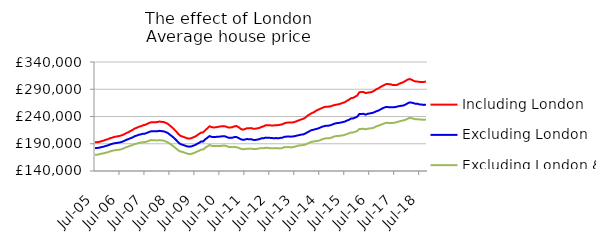
| Category | Including London | Excluding London | Excluding London & SE |
|---|---|---|---|
| 2005-07-01 | 192637.159 | 181907.72 | 169795.831 |
| 2005-08-01 | 192884.354 | 182204.23 | 169987.184 |
| 2005-09-01 | 193456.443 | 182742.056 | 170702.858 |
| 2005-10-01 | 194586.143 | 183737.129 | 171701.029 |
| 2005-11-01 | 195531.81 | 184532.419 | 172389.265 |
| 2005-12-01 | 197150.584 | 185848.339 | 173484.345 |
| 2006-01-01 | 198153.754 | 186784.385 | 174234.386 |
| 2006-02-01 | 199813.466 | 188293.933 | 175667.543 |
| 2006-03-01 | 200983.99 | 189563.153 | 176864.263 |
| 2006-04-01 | 202245.961 | 190631.185 | 177763.943 |
| 2006-05-01 | 203065.042 | 191320.143 | 178237.47 |
| 2006-06-01 | 203685.673 | 191766.348 | 178667.182 |
| 2006-07-01 | 204559.278 | 192518.713 | 179240.302 |
| 2006-08-01 | 205714.078 | 193584.707 | 180374.517 |
| 2006-09-01 | 207431.746 | 195106.329 | 181749.008 |
| 2006-10-01 | 209492.23 | 197111.646 | 183707.283 |
| 2006-11-01 | 211163.513 | 198406.834 | 184803.513 |
| 2006-12-01 | 213373.811 | 200184.26 | 186416.618 |
| 2007-01-01 | 215210.655 | 201535.877 | 187495.779 |
| 2007-02-01 | 217819.553 | 203758.447 | 189382.285 |
| 2007-03-01 | 219232.983 | 204906.873 | 190190.222 |
| 2007-04-01 | 221043.784 | 206461.247 | 191479.848 |
| 2007-05-01 | 222128.218 | 207210.749 | 192197.244 |
| 2007-06-01 | 223865.002 | 208372.622 | 192900.311 |
| 2007-07-01 | 224582.145 | 208580.061 | 193035.973 |
| 2007-08-01 | 226402.251 | 210003.659 | 194051.294 |
| 2007-09-01 | 228182.408 | 211660.89 | 195600.841 |
| 2007-10-01 | 229491.543 | 212979.597 | 196744.628 |
| 2007-11-01 | 229231.088 | 212815.295 | 196339.408 |
| 2007-12-01 | 229404.46 | 212905.332 | 196268.186 |
| 2008-01-01 | 229854.007 | 213027.6 | 195912.124 |
| 2008-02-01 | 230778.597 | 213705.985 | 196694.794 |
| 2008-03-01 | 230153.08 | 213164.837 | 196101.029 |
| 2008-04-01 | 229721.005 | 212737.65 | 195822.963 |
| 2008-05-01 | 228299.829 | 211346.238 | 194168.374 |
| 2008-06-01 | 226513.482 | 209628.718 | 192662.12 |
| 2008-07-01 | 223227.056 | 206570.363 | 189831.839 |
| 2008-08-01 | 220141.088 | 203679.753 | 187225.176 |
| 2008-09-01 | 216463.272 | 200406.398 | 184122.693 |
| 2008-10-01 | 212510.657 | 196770.87 | 181148.64 |
| 2008-11-01 | 207922.628 | 192723.223 | 178029.517 |
| 2008-12-01 | 204675.242 | 189438.674 | 175758.498 |
| 2009-01-01 | 203165.33 | 188120.612 | 174922.017 |
| 2009-02-01 | 201911.844 | 186937.237 | 173762.452 |
| 2009-03-01 | 200225.813 | 185488.87 | 172349.467 |
| 2009-04-01 | 199383.576 | 184697.341 | 171110.985 |
| 2009-05-01 | 199859.253 | 184756.733 | 171205.109 |
| 2009-06-01 | 201412.925 | 186174.835 | 172334.989 |
| 2009-07-01 | 203027.61 | 187480.446 | 173713.12 |
| 2009-08-01 | 205323.71 | 189670.327 | 175544.14 |
| 2009-09-01 | 208069.093 | 191780.428 | 177250.424 |
| 2009-10-01 | 210492.42 | 194114.663 | 179195.013 |
| 2009-11-01 | 210907.6 | 194343.802 | 179474.947 |
| 2009-12-01 | 215086.622 | 198299.021 | 182879.128 |
| 2010-01-01 | 218354.797 | 201001.848 | 185163.534 |
| 2010-02-01 | 222015.55 | 204057.089 | 187708.694 |
| 2010-03-01 | 220623.663 | 202645.504 | 186217.211 |
| 2010-04-01 | 219905.901 | 202176.286 | 185722.593 |
| 2010-05-01 | 220113.626 | 202560.477 | 185660.627 |
| 2010-06-01 | 220921.717 | 202881.827 | 185810.225 |
| 2010-07-01 | 221564.916 | 203122.974 | 185746.775 |
| 2010-08-01 | 222318.029 | 203658.874 | 186337.462 |
| 2010-09-01 | 222269.425 | 203857.033 | 186786.545 |
| 2010-10-01 | 221434.684 | 202970.552 | 186021.486 |
| 2010-11-01 | 219854.924 | 201144.854 | 184354.861 |
| 2010-12-01 | 219866.03 | 200772.354 | 183953.951 |
| 2011-01-01 | 220405.999 | 201085.753 | 183724.506 |
| 2011-02-01 | 222145.885 | 202302.374 | 184279.405 |
| 2011-03-01 | 222431.145 | 202224.902 | 183521.52 |
| 2011-04-01 | 220277.333 | 200405.646 | 182499.86 |
| 2011-05-01 | 217364.071 | 198328.18 | 180845.101 |
| 2011-06-01 | 215781.529 | 197203.528 | 180025.16 |
| 2011-07-01 | 216886.961 | 197679.846 | 180204.195 |
| 2011-08-01 | 218462.386 | 198609.764 | 180911.764 |
| 2011-09-01 | 218447.96 | 198336.118 | 180896.336 |
| 2011-10-01 | 218746.451 | 198390.032 | 181179.074 |
| 2011-11-01 | 217505.539 | 197130.138 | 180183.324 |
| 2011-12-01 | 217590.911 | 196985.648 | 180310.287 |
| 2012-01-01 | 218300.924 | 197626.217 | 180700.792 |
| 2012-02-01 | 219064.04 | 198509.293 | 181516.234 |
| 2012-03-01 | 220982.893 | 200008.532 | 182063.76 |
| 2012-04-01 | 221888.073 | 200155.168 | 181813.842 |
| 2012-05-01 | 224080.255 | 201265.513 | 182442.614 |
| 2012-06-01 | 224094.767 | 201103.147 | 182450.163 |
| 2012-07-01 | 223904.739 | 200785.472 | 181887.565 |
| 2012-08-01 | 223391.425 | 200470.454 | 181782.505 |
| 2012-09-01 | 223676.621 | 200097.203 | 181530.42 |
| 2012-10-01 | 224076.65 | 200441.649 | 182155.422 |
| 2012-11-01 | 224222.02 | 199942.059 | 181394.869 |
| 2012-12-01 | 224932.069 | 200752.198 | 181819.304 |
| 2013-01-01 | 225725.691 | 200982.997 | 181992.077 |
| 2013-02-01 | 227657.684 | 202887.461 | 183982.638 |
| 2013-03-01 | 228536.318 | 203048.201 | 183714.128 |
| 2013-04-01 | 229161.736 | 203446.577 | 184041.738 |
| 2013-05-01 | 228933.746 | 202978.692 | 183179.668 |
| 2013-06-01 | 229215.618 | 203313.988 | 184002.652 |
| 2013-07-01 | 230067.874 | 204001.956 | 184567.567 |
| 2013-08-01 | 231582.352 | 204974.592 | 185829.063 |
| 2013-09-01 | 233071.269 | 205820.443 | 186816.952 |
| 2013-10-01 | 234544.706 | 206712.595 | 187392.956 |
| 2013-11-01 | 235649.654 | 207108.713 | 187518.32 |
| 2013-12-01 | 237829.132 | 208690.471 | 188380.852 |
| 2014-01-01 | 241172.518 | 210845.071 | 190258.481 |
| 2014-02-01 | 243555.901 | 212961.021 | 191924.926 |
| 2014-03-01 | 246091.044 | 214920.699 | 193529.609 |
| 2014-04-01 | 247497.872 | 215742.692 | 194071.52 |
| 2014-05-01 | 250020.497 | 216873.39 | 194767.88 |
| 2014-06-01 | 252131.969 | 217799.223 | 195254.109 |
| 2014-07-01 | 253728.94 | 219290.342 | 196257.739 |
| 2014-08-01 | 255600.623 | 221085.588 | 198018.95 |
| 2014-09-01 | 257111.229 | 222135.43 | 199079.718 |
| 2014-10-01 | 258073.581 | 223029.625 | 200160.045 |
| 2014-11-01 | 258087.083 | 223011.964 | 199843.07 |
| 2014-12-01 | 258355.146 | 223877.078 | 200718.802 |
| 2015-01-01 | 259818.582 | 225210.893 | 201785.11 |
| 2015-02-01 | 261058.597 | 226814.296 | 203490.572 |
| 2015-03-01 | 261701.1 | 227767.121 | 204141.593 |
| 2015-04-01 | 262401.663 | 228109.591 | 204365.531 |
| 2015-05-01 | 263522.572 | 228848.656 | 204714.335 |
| 2015-06-01 | 265038.057 | 229662.855 | 205471.122 |
| 2015-07-01 | 266149.558 | 230709.975 | 206333.662 |
| 2015-08-01 | 268751.273 | 232422.039 | 208026.359 |
| 2015-09-01 | 270772.804 | 233951.289 | 209022.454 |
| 2015-10-01 | 273642.208 | 236127.485 | 210714.392 |
| 2015-11-01 | 274283.861 | 236389.602 | 210643.36 |
| 2015-12-01 | 276419.926 | 238068.942 | 212021.052 |
| 2016-01-01 | 278666.894 | 239684.952 | 213316.584 |
| 2016-02-01 | 284429.326 | 244573.995 | 217105.031 |
| 2016-03-01 | 284960.108 | 244731.444 | 217261.044 |
| 2016-04-01 | 284944.646 | 244897.165 | 217499.971 |
| 2016-05-01 | 282948.008 | 243398.657 | 216367.949 |
| 2016-06-01 | 283814.098 | 244972.216 | 217645.462 |
| 2016-07-01 | 284190.963 | 245619.864 | 217954.862 |
| 2016-08-01 | 285049.367 | 246455.532 | 218604.261 |
| 2016-09-01 | 286912.583 | 247394.501 | 219476.719 |
| 2016-10-01 | 289670.712 | 249511.292 | 221752.508 |
| 2016-11-01 | 291498.925 | 250634.807 | 222803.879 |
| 2016-12-01 | 293658.117 | 252653.031 | 224422.401 |
| 2017-01-01 | 296049.418 | 254646.437 | 225831.329 |
| 2017-02-01 | 297925.237 | 256460.156 | 227390.253 |
| 2017-03-01 | 299532.119 | 257557.314 | 228485.376 |
| 2017-04-01 | 299408.036 | 257165.736 | 228177.52 |
| 2017-05-01 | 299179.201 | 257163.436 | 228274.173 |
| 2017-06-01 | 297870.311 | 256785.851 | 228169.11 |
| 2017-07-01 | 297602.741 | 257231.206 | 228724.872 |
| 2017-08-01 | 297916.304 | 257973.55 | 229619.949 |
| 2017-09-01 | 299828.795 | 258898.844 | 230825.26 |
| 2017-10-01 | 301366.804 | 259633.277 | 231948.089 |
| 2017-11-01 | 302750.658 | 260024.047 | 232601.005 |
| 2017-12-01 | 304910.485 | 261557.789 | 233772.752 |
| 2018-01-01 | 307355.808 | 263733.261 | 235485.643 |
| 2018-02-01 | 308704.277 | 265801.473 | 237237.721 |
| 2018-03-01 | 307742.642 | 265487.481 | 236886.087 |
| 2018-04-01 | 305649.673 | 264683.991 | 236013.006 |
| 2018-05-01 | 304346.084 | 263178.248 | 234742.055 |
| 2018-06-01 | 304018.536 | 263232.732 | 235045.28 |
| 2018-07-01 | 303395.175 | 262019.118 | 234270.194 |
| 2018-08-01 | 303484.286 | 261869.578 | 234324.25 |
| 2018-09-01 | 303180.318 | 261254.646 | 233895.469 |
| 2018-10-01 | 304433.073 | 261834.439 | 234568.135 |